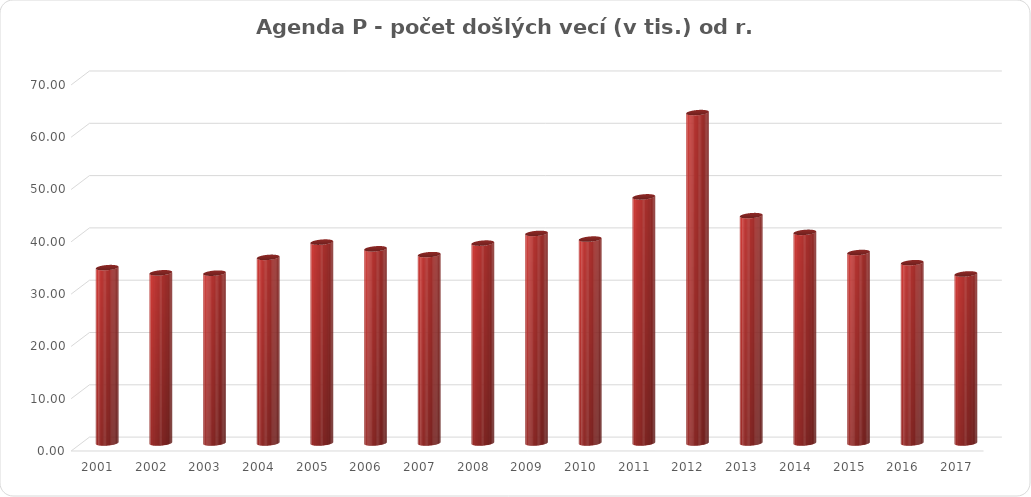
| Category | Series 1 |
|---|---|
| 2001.0 | 33.53 |
| 2002.0 | 32.54 |
| 2003.0 | 32.47 |
| 2004.0 | 35.49 |
| 2005.0 | 38.41 |
| 2006.0 | 37.13 |
| 2007.0 | 36.01 |
| 2008.0 | 38.22 |
| 2009.0 | 40.07 |
| 2010.0 | 38.99 |
| 2011.0 | 47.06 |
| 2012.0 | 63.17 |
| 2013.0 | 43.47 |
| 2014.0 | 40.27 |
| 2015.0 | 36.42 |
| 2016.0 | 34.472 |
| 2017.0 | 32.32 |